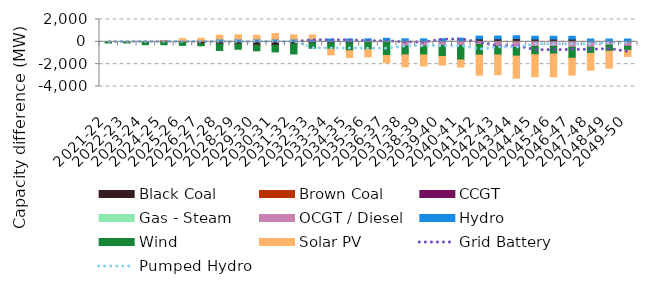
| Category | Black Coal | Brown Coal | CCGT | Gas - Steam | OCGT / Diesel | Hydro | Wind | Solar PV |
|---|---|---|---|---|---|---|---|---|
| 2021-22 | 0 | 0 | 0 | 0 | 0 | 0 | -106.956 | 0 |
| 2022-23 | 0 | 0 | 0 | 0 | 0 | 0 | -106.956 | 0 |
| 2023-24 | 0 | 0 | 0 | 0 | 0 | 0 | -254.766 | 0 |
| 2024-25 | 12.593 | 79.659 | 0 | 0 | 0 | 0 | -262.856 | 0 |
| 2025-26 | -34.894 | 89.586 | 0 | 0 | 0 | 0 | -283.27 | 197.149 |
| 2026-27 | -177.914 | 128.596 | 0 | 0 | 0 | 0 | -173.704 | 197.149 |
| 2027-28 | -210.259 | -0.002 | 0 | 0 | 0 | 250 | -561.781 | 344.442 |
| 2028-29 | -210.259 | -0.001 | 0 | 0 | 0 | 250 | -454.81 | 378.759 |
| 2029-30 | -312.375 | -0.001 | 0 | 0 | 0 | 250 | -488.134 | 337.542 |
| 2030-31 | -312.375 | -0.001 | 0 | 0 | 0 | 250 | -590.826 | 493.263 |
| 2031-32 | -196.674 | -0.001 | 0 | 0 | 0 | 250 | -889.01 | 369.091 |
| 2032-33 | -125.653 | -0.001 | 0 | 0 | 0 | 250 | -454.847 | 368.175 |
| 2033-34 | -126.112 | -0.001 | 0 | 0 | 0 | 250 | -531.797 | -516.307 |
| 2034-35 | -126.112 | -0.001 | 0 | 0 | 0 | 250 | -674.902 | -605.507 |
| 2035-36 | 16.38 | -0.001 | 0 | 0 | -46.19 | 250 | -655.01 | -646.589 |
| 2036-37 | 65.018 | -0.001 | 0 | 0 | -46.19 | 250 | -1179.43 | -646.589 |
| 2037-38 | 17.532 | -0.001 | 0 | 0 | -378.847 | 250 | -790.931 | -1064.809 |
| 2038-39 | 17.532 | -0.001 | 0 | 0 | -378.847 | 250 | -791.088 | -981.19 |
| 2039-40 | 17.532 | -0.001 | 0 | 0 | -321.757 | 250 | -986.318 | -769.617 |
| 2040-41 | 77.905 | -0.001 | 0 | 0 | -321.757 | 250 | -1306.263 | -624.972 |
| 2041-42 | 265.312 | -0.001 | 0 | 0 | -226.596 | 250 | -966.697 | -1799.094 |
| 2042-43 | 265.312 | -0.001 | 0 | 0 | -396.191 | 250 | -783.975 | -1760.873 |
| 2043-44 | 292.281 | -0.001 | 0 | 0 | -497.142 | 250 | -781.725 | -1971.908 |
| 2044-45 | 247.78 | -0.001 | 0 | 0 | -417.555 | 250 | -732.43 | -1971.908 |
| 2045-46 | 247.78 | 0 | 0 | 0 | -417.555 | 250 | -672.251 | -2050.113 |
| 2046-47 | 247.78 | 0 | 0 | 0 | -486.678 | 250 | -984.129 | -1508.213 |
| 2047-48 | 0 | 0 | 0 | 0 | -486.678 | 250 | -546.223 | -1508.213 |
| 2048-49 | 0 | 0 | 0 | 0 | -296.377 | 250 | -549.327 | -1508.213 |
| 2049-50 | 0 | 0 | 0 | 0 | -400.978 | 250 | -361.055 | -553.808 |